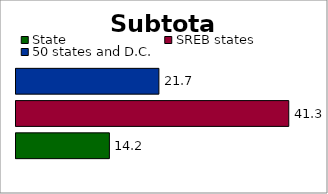
| Category | State | SREB states | 50 states and D.C. |
|---|---|---|---|
| 0 | 14.152 | 41.329 | 21.651 |